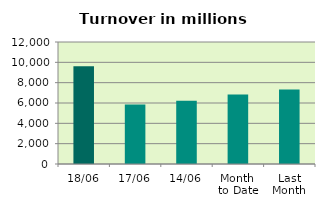
| Category | Series 0 |
|---|---|
| 18/06 | 9607.465 |
| 17/06 | 5862.058 |
| 14/06 | 6223.702 |
| Month 
to Date | 6847.601 |
| Last
Month | 7336.2 |